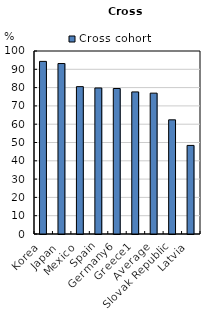
| Category | Cross cohort |
|---|---|
| Korea | 94.328 |
| Japan | 93.145 |
| Mexico | 80.531 |
| Spain | 79.797 |
| Germany6 | 79.5 |
| Greece1 | 77.641 |
| Average | 76.966 |
| Slovak Republic | 62.382 |
| Latvia | 48.405 |